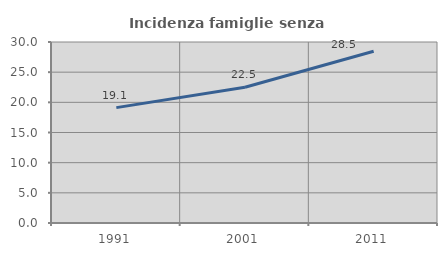
| Category | Incidenza famiglie senza nuclei |
|---|---|
| 1991.0 | 19.122 |
| 2001.0 | 22.504 |
| 2011.0 | 28.474 |